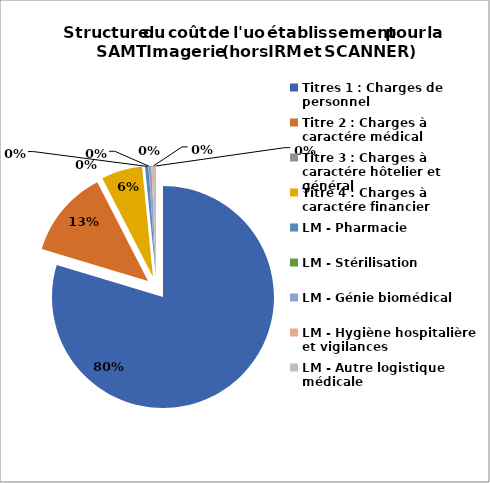
| Category | Series 0 |
|---|---|
| Titres 1 : Charges de personnel | 0.797 |
| Titre 2 : Charges à caractére médical | 0.128 |
| Titre 3 : Charges à caractére hôtelier et général | 0 |
| Titre 4 : Charges à caractére financier | 0.06 |
| LM - Pharmacie | 0.005 |
| LM - Stérilisation | 0 |
| LM - Génie biomédical | 0.004 |
| LM - Hygiène hospitalière et vigilances | 0.002 |
| LM - Autre logistique médicale | 0.005 |